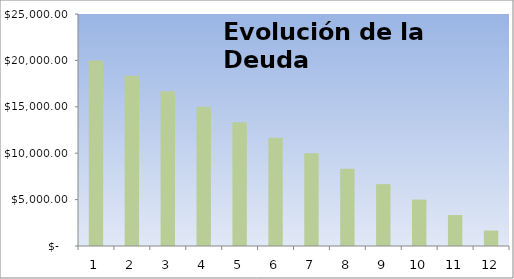
| Category | Series 1 |
|---|---|
| 1.0 | 20000 |
| 2.0 | 18333.333 |
| 3.0 | 16666.667 |
| 4.0 | 15000 |
| 5.0 | 13333.333 |
| 6.0 | 11666.667 |
| 7.0 | 10000 |
| 8.0 | 8333.333 |
| 9.0 | 6666.667 |
| 10.0 | 5000 |
| 11.0 | 3333.333 |
| 12.0 | 1666.667 |